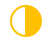
| Category | Series 0 |
|---|---|
| 0 | 50 |
| 1 | 50 |